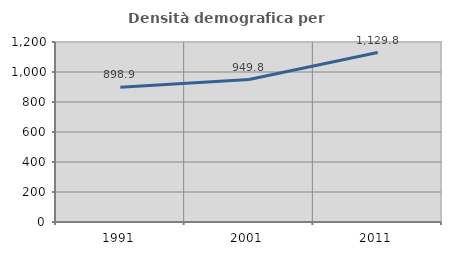
| Category | Densità demografica |
|---|---|
| 1991.0 | 898.918 |
| 2001.0 | 949.806 |
| 2011.0 | 1129.784 |